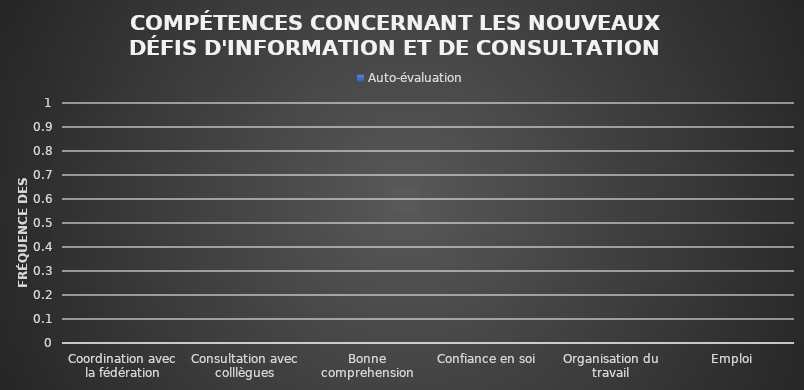
| Category | Αuto-évaluation |
|---|---|
| Coordination avec la fédération | 0 |
| Consultation avec colllègues | 0 |
| Bonne comprehension | 0 |
| Confiance en soi | 0 |
| Organisation du travail | 0 |
| Emploi | 0 |